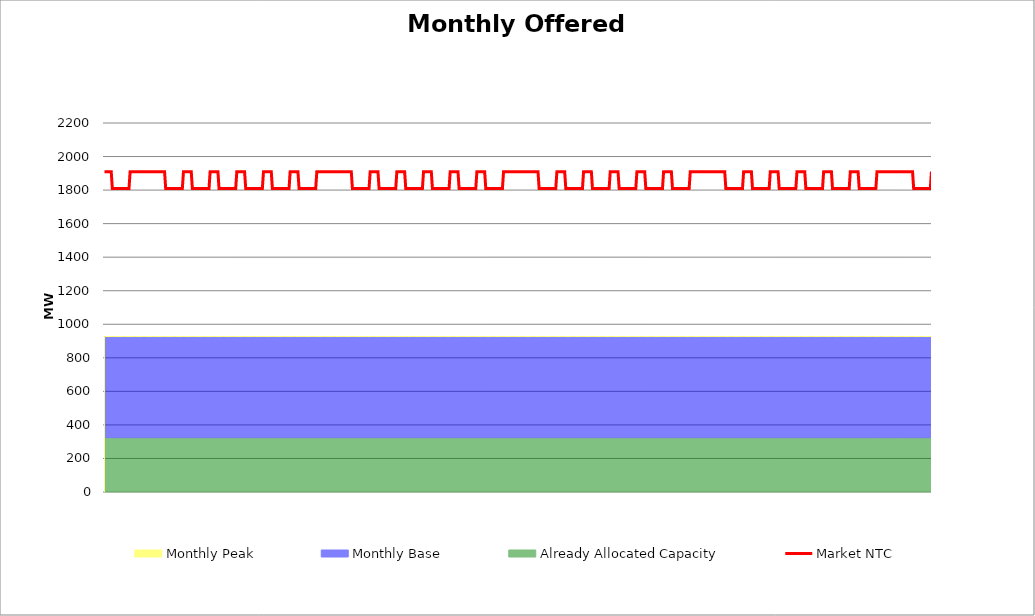
| Category | Market NTC |
|---|---|
| 0 | 1910 |
| 1 | 1910 |
| 2 | 1910 |
| 3 | 1910 |
| 4 | 1910 |
| 5 | 1910 |
| 6 | 1910 |
| 7 | 1810 |
| 8 | 1810 |
| 9 | 1810 |
| 10 | 1810 |
| 11 | 1810 |
| 12 | 1810 |
| 13 | 1810 |
| 14 | 1810 |
| 15 | 1810 |
| 16 | 1810 |
| 17 | 1810 |
| 18 | 1810 |
| 19 | 1810 |
| 20 | 1810 |
| 21 | 1810 |
| 22 | 1810 |
| 23 | 1910 |
| 24 | 1910 |
| 25 | 1910 |
| 26 | 1910 |
| 27 | 1910 |
| 28 | 1910 |
| 29 | 1910 |
| 30 | 1910 |
| 31 | 1910 |
| 32 | 1910 |
| 33 | 1910 |
| 34 | 1910 |
| 35 | 1910 |
| 36 | 1910 |
| 37 | 1910 |
| 38 | 1910 |
| 39 | 1910 |
| 40 | 1910 |
| 41 | 1910 |
| 42 | 1910 |
| 43 | 1910 |
| 44 | 1910 |
| 45 | 1910 |
| 46 | 1910 |
| 47 | 1910 |
| 48 | 1910 |
| 49 | 1910 |
| 50 | 1910 |
| 51 | 1910 |
| 52 | 1910 |
| 53 | 1910 |
| 54 | 1910 |
| 55 | 1810 |
| 56 | 1810 |
| 57 | 1810 |
| 58 | 1810 |
| 59 | 1810 |
| 60 | 1810 |
| 61 | 1810 |
| 62 | 1810 |
| 63 | 1810 |
| 64 | 1810 |
| 65 | 1810 |
| 66 | 1810 |
| 67 | 1810 |
| 68 | 1810 |
| 69 | 1810 |
| 70 | 1810 |
| 71 | 1910 |
| 72 | 1910 |
| 73 | 1910 |
| 74 | 1910 |
| 75 | 1910 |
| 76 | 1910 |
| 77 | 1910 |
| 78 | 1910 |
| 79 | 1810 |
| 80 | 1810 |
| 81 | 1810 |
| 82 | 1810 |
| 83 | 1810 |
| 84 | 1810 |
| 85 | 1810 |
| 86 | 1810 |
| 87 | 1810 |
| 88 | 1810 |
| 89 | 1810 |
| 90 | 1810 |
| 91 | 1810 |
| 92 | 1810 |
| 93 | 1810 |
| 94 | 1810 |
| 95 | 1910 |
| 96 | 1910 |
| 97 | 1910 |
| 98 | 1910 |
| 99 | 1910 |
| 100 | 1910 |
| 101 | 1910 |
| 102 | 1910 |
| 103 | 1810 |
| 104 | 1810 |
| 105 | 1810 |
| 106 | 1810 |
| 107 | 1810 |
| 108 | 1810 |
| 109 | 1810 |
| 110 | 1810 |
| 111 | 1810 |
| 112 | 1810 |
| 113 | 1810 |
| 114 | 1810 |
| 115 | 1810 |
| 116 | 1810 |
| 117 | 1810 |
| 118 | 1810 |
| 119 | 1910 |
| 120 | 1910 |
| 121 | 1910 |
| 122 | 1910 |
| 123 | 1910 |
| 124 | 1910 |
| 125 | 1910 |
| 126 | 1910 |
| 127 | 1810 |
| 128 | 1810 |
| 129 | 1810 |
| 130 | 1810 |
| 131 | 1810 |
| 132 | 1810 |
| 133 | 1810 |
| 134 | 1810 |
| 135 | 1810 |
| 136 | 1810 |
| 137 | 1810 |
| 138 | 1810 |
| 139 | 1810 |
| 140 | 1810 |
| 141 | 1810 |
| 142 | 1810 |
| 143 | 1910 |
| 144 | 1910 |
| 145 | 1910 |
| 146 | 1910 |
| 147 | 1910 |
| 148 | 1910 |
| 149 | 1910 |
| 150 | 1910 |
| 151 | 1810 |
| 152 | 1810 |
| 153 | 1810 |
| 154 | 1810 |
| 155 | 1810 |
| 156 | 1810 |
| 157 | 1810 |
| 158 | 1810 |
| 159 | 1810 |
| 160 | 1810 |
| 161 | 1810 |
| 162 | 1810 |
| 163 | 1810 |
| 164 | 1810 |
| 165 | 1810 |
| 166 | 1810 |
| 167 | 1910 |
| 168 | 1910 |
| 169 | 1910 |
| 170 | 1910 |
| 171 | 1910 |
| 172 | 1910 |
| 173 | 1910 |
| 174 | 1910 |
| 175 | 1810 |
| 176 | 1810 |
| 177 | 1810 |
| 178 | 1810 |
| 179 | 1810 |
| 180 | 1810 |
| 181 | 1810 |
| 182 | 1810 |
| 183 | 1810 |
| 184 | 1810 |
| 185 | 1810 |
| 186 | 1810 |
| 187 | 1810 |
| 188 | 1810 |
| 189 | 1810 |
| 190 | 1810 |
| 191 | 1910 |
| 192 | 1910 |
| 193 | 1910 |
| 194 | 1910 |
| 195 | 1910 |
| 196 | 1910 |
| 197 | 1910 |
| 198 | 1910 |
| 199 | 1910 |
| 200 | 1910 |
| 201 | 1910 |
| 202 | 1910 |
| 203 | 1910 |
| 204 | 1910 |
| 205 | 1910 |
| 206 | 1910 |
| 207 | 1910 |
| 208 | 1910 |
| 209 | 1910 |
| 210 | 1910 |
| 211 | 1910 |
| 212 | 1910 |
| 213 | 1910 |
| 214 | 1910 |
| 215 | 1910 |
| 216 | 1910 |
| 217 | 1910 |
| 218 | 1910 |
| 219 | 1910 |
| 220 | 1910 |
| 221 | 1910 |
| 222 | 1910 |
| 223 | 1810 |
| 224 | 1810 |
| 225 | 1810 |
| 226 | 1810 |
| 227 | 1810 |
| 228 | 1810 |
| 229 | 1810 |
| 230 | 1810 |
| 231 | 1810 |
| 232 | 1810 |
| 233 | 1810 |
| 234 | 1810 |
| 235 | 1810 |
| 236 | 1810 |
| 237 | 1810 |
| 238 | 1810 |
| 239 | 1910 |
| 240 | 1910 |
| 241 | 1910 |
| 242 | 1910 |
| 243 | 1910 |
| 244 | 1910 |
| 245 | 1910 |
| 246 | 1910 |
| 247 | 1810 |
| 248 | 1810 |
| 249 | 1810 |
| 250 | 1810 |
| 251 | 1810 |
| 252 | 1810 |
| 253 | 1810 |
| 254 | 1810 |
| 255 | 1810 |
| 256 | 1810 |
| 257 | 1810 |
| 258 | 1810 |
| 259 | 1810 |
| 260 | 1810 |
| 261 | 1810 |
| 262 | 1810 |
| 263 | 1910 |
| 264 | 1910 |
| 265 | 1910 |
| 266 | 1910 |
| 267 | 1910 |
| 268 | 1910 |
| 269 | 1910 |
| 270 | 1910 |
| 271 | 1810 |
| 272 | 1810 |
| 273 | 1810 |
| 274 | 1810 |
| 275 | 1810 |
| 276 | 1810 |
| 277 | 1810 |
| 278 | 1810 |
| 279 | 1810 |
| 280 | 1810 |
| 281 | 1810 |
| 282 | 1810 |
| 283 | 1810 |
| 284 | 1810 |
| 285 | 1810 |
| 286 | 1810 |
| 287 | 1910 |
| 288 | 1910 |
| 289 | 1910 |
| 290 | 1910 |
| 291 | 1910 |
| 292 | 1910 |
| 293 | 1910 |
| 294 | 1910 |
| 295 | 1810 |
| 296 | 1810 |
| 297 | 1810 |
| 298 | 1810 |
| 299 | 1810 |
| 300 | 1810 |
| 301 | 1810 |
| 302 | 1810 |
| 303 | 1810 |
| 304 | 1810 |
| 305 | 1810 |
| 306 | 1810 |
| 307 | 1810 |
| 308 | 1810 |
| 309 | 1810 |
| 310 | 1810 |
| 311 | 1910 |
| 312 | 1910 |
| 313 | 1910 |
| 314 | 1910 |
| 315 | 1910 |
| 316 | 1910 |
| 317 | 1910 |
| 318 | 1910 |
| 319 | 1810 |
| 320 | 1810 |
| 321 | 1810 |
| 322 | 1810 |
| 323 | 1810 |
| 324 | 1810 |
| 325 | 1810 |
| 326 | 1810 |
| 327 | 1810 |
| 328 | 1810 |
| 329 | 1810 |
| 330 | 1810 |
| 331 | 1810 |
| 332 | 1810 |
| 333 | 1810 |
| 334 | 1810 |
| 335 | 1910 |
| 336 | 1910 |
| 337 | 1910 |
| 338 | 1910 |
| 339 | 1910 |
| 340 | 1910 |
| 341 | 1910 |
| 342 | 1910 |
| 343 | 1810 |
| 344 | 1810 |
| 345 | 1810 |
| 346 | 1810 |
| 347 | 1810 |
| 348 | 1810 |
| 349 | 1810 |
| 350 | 1810 |
| 351 | 1810 |
| 352 | 1810 |
| 353 | 1810 |
| 354 | 1810 |
| 355 | 1810 |
| 356 | 1810 |
| 357 | 1810 |
| 358 | 1810 |
| 359 | 1910 |
| 360 | 1910 |
| 361 | 1910 |
| 362 | 1910 |
| 363 | 1910 |
| 364 | 1910 |
| 365 | 1910 |
| 366 | 1910 |
| 367 | 1910 |
| 368 | 1910 |
| 369 | 1910 |
| 370 | 1910 |
| 371 | 1910 |
| 372 | 1910 |
| 373 | 1910 |
| 374 | 1910 |
| 375 | 1910 |
| 376 | 1910 |
| 377 | 1910 |
| 378 | 1910 |
| 379 | 1910 |
| 380 | 1910 |
| 381 | 1910 |
| 382 | 1910 |
| 383 | 1910 |
| 384 | 1910 |
| 385 | 1910 |
| 386 | 1910 |
| 387 | 1910 |
| 388 | 1910 |
| 389 | 1910 |
| 390 | 1910 |
| 391 | 1810 |
| 392 | 1810 |
| 393 | 1810 |
| 394 | 1810 |
| 395 | 1810 |
| 396 | 1810 |
| 397 | 1810 |
| 398 | 1810 |
| 399 | 1810 |
| 400 | 1810 |
| 401 | 1810 |
| 402 | 1810 |
| 403 | 1810 |
| 404 | 1810 |
| 405 | 1810 |
| 406 | 1810 |
| 407 | 1910 |
| 408 | 1910 |
| 409 | 1910 |
| 410 | 1910 |
| 411 | 1910 |
| 412 | 1910 |
| 413 | 1910 |
| 414 | 1910 |
| 415 | 1810 |
| 416 | 1810 |
| 417 | 1810 |
| 418 | 1810 |
| 419 | 1810 |
| 420 | 1810 |
| 421 | 1810 |
| 422 | 1810 |
| 423 | 1810 |
| 424 | 1810 |
| 425 | 1810 |
| 426 | 1810 |
| 427 | 1810 |
| 428 | 1810 |
| 429 | 1810 |
| 430 | 1810 |
| 431 | 1910 |
| 432 | 1910 |
| 433 | 1910 |
| 434 | 1910 |
| 435 | 1910 |
| 436 | 1910 |
| 437 | 1910 |
| 438 | 1910 |
| 439 | 1810 |
| 440 | 1810 |
| 441 | 1810 |
| 442 | 1810 |
| 443 | 1810 |
| 444 | 1810 |
| 445 | 1810 |
| 446 | 1810 |
| 447 | 1810 |
| 448 | 1810 |
| 449 | 1810 |
| 450 | 1810 |
| 451 | 1810 |
| 452 | 1810 |
| 453 | 1810 |
| 454 | 1810 |
| 455 | 1910 |
| 456 | 1910 |
| 457 | 1910 |
| 458 | 1910 |
| 459 | 1910 |
| 460 | 1910 |
| 461 | 1910 |
| 462 | 1910 |
| 463 | 1810 |
| 464 | 1810 |
| 465 | 1810 |
| 466 | 1810 |
| 467 | 1810 |
| 468 | 1810 |
| 469 | 1810 |
| 470 | 1810 |
| 471 | 1810 |
| 472 | 1810 |
| 473 | 1810 |
| 474 | 1810 |
| 475 | 1810 |
| 476 | 1810 |
| 477 | 1810 |
| 478 | 1810 |
| 479 | 1910 |
| 480 | 1910 |
| 481 | 1910 |
| 482 | 1910 |
| 483 | 1910 |
| 484 | 1910 |
| 485 | 1910 |
| 486 | 1910 |
| 487 | 1810 |
| 488 | 1810 |
| 489 | 1810 |
| 490 | 1810 |
| 491 | 1810 |
| 492 | 1810 |
| 493 | 1810 |
| 494 | 1810 |
| 495 | 1810 |
| 496 | 1810 |
| 497 | 1810 |
| 498 | 1810 |
| 499 | 1810 |
| 500 | 1810 |
| 501 | 1810 |
| 502 | 1810 |
| 503 | 1910 |
| 504 | 1910 |
| 505 | 1910 |
| 506 | 1910 |
| 507 | 1910 |
| 508 | 1910 |
| 509 | 1910 |
| 510 | 1910 |
| 511 | 1810 |
| 512 | 1810 |
| 513 | 1810 |
| 514 | 1810 |
| 515 | 1810 |
| 516 | 1810 |
| 517 | 1810 |
| 518 | 1810 |
| 519 | 1810 |
| 520 | 1810 |
| 521 | 1810 |
| 522 | 1810 |
| 523 | 1810 |
| 524 | 1810 |
| 525 | 1810 |
| 526 | 1810 |
| 527 | 1910 |
| 528 | 1910 |
| 529 | 1910 |
| 530 | 1910 |
| 531 | 1910 |
| 532 | 1910 |
| 533 | 1910 |
| 534 | 1910 |
| 535 | 1910 |
| 536 | 1910 |
| 537 | 1910 |
| 538 | 1910 |
| 539 | 1910 |
| 540 | 1910 |
| 541 | 1910 |
| 542 | 1910 |
| 543 | 1910 |
| 544 | 1910 |
| 545 | 1910 |
| 546 | 1910 |
| 547 | 1910 |
| 548 | 1910 |
| 549 | 1910 |
| 550 | 1910 |
| 551 | 1910 |
| 552 | 1910 |
| 553 | 1910 |
| 554 | 1910 |
| 555 | 1910 |
| 556 | 1910 |
| 557 | 1910 |
| 558 | 1910 |
| 559 | 1810 |
| 560 | 1810 |
| 561 | 1810 |
| 562 | 1810 |
| 563 | 1810 |
| 564 | 1810 |
| 565 | 1810 |
| 566 | 1810 |
| 567 | 1810 |
| 568 | 1810 |
| 569 | 1810 |
| 570 | 1810 |
| 571 | 1810 |
| 572 | 1810 |
| 573 | 1810 |
| 574 | 1810 |
| 575 | 1910 |
| 576 | 1910 |
| 577 | 1910 |
| 578 | 1910 |
| 579 | 1910 |
| 580 | 1910 |
| 581 | 1910 |
| 582 | 1910 |
| 583 | 1810 |
| 584 | 1810 |
| 585 | 1810 |
| 586 | 1810 |
| 587 | 1810 |
| 588 | 1810 |
| 589 | 1810 |
| 590 | 1810 |
| 591 | 1810 |
| 592 | 1810 |
| 593 | 1810 |
| 594 | 1810 |
| 595 | 1810 |
| 596 | 1810 |
| 597 | 1810 |
| 598 | 1810 |
| 599 | 1910 |
| 600 | 1910 |
| 601 | 1910 |
| 602 | 1910 |
| 603 | 1910 |
| 604 | 1910 |
| 605 | 1910 |
| 606 | 1910 |
| 607 | 1810 |
| 608 | 1810 |
| 609 | 1810 |
| 610 | 1810 |
| 611 | 1810 |
| 612 | 1810 |
| 613 | 1810 |
| 614 | 1810 |
| 615 | 1810 |
| 616 | 1810 |
| 617 | 1810 |
| 618 | 1810 |
| 619 | 1810 |
| 620 | 1810 |
| 621 | 1810 |
| 622 | 1810 |
| 623 | 1910 |
| 624 | 1910 |
| 625 | 1910 |
| 626 | 1910 |
| 627 | 1910 |
| 628 | 1910 |
| 629 | 1910 |
| 630 | 1910 |
| 631 | 1810 |
| 632 | 1810 |
| 633 | 1810 |
| 634 | 1810 |
| 635 | 1810 |
| 636 | 1810 |
| 637 | 1810 |
| 638 | 1810 |
| 639 | 1810 |
| 640 | 1810 |
| 641 | 1810 |
| 642 | 1810 |
| 643 | 1810 |
| 644 | 1810 |
| 645 | 1810 |
| 646 | 1810 |
| 647 | 1910 |
| 648 | 1910 |
| 649 | 1910 |
| 650 | 1910 |
| 651 | 1910 |
| 652 | 1910 |
| 653 | 1910 |
| 654 | 1910 |
| 655 | 1810 |
| 656 | 1810 |
| 657 | 1810 |
| 658 | 1810 |
| 659 | 1810 |
| 660 | 1810 |
| 661 | 1810 |
| 662 | 1810 |
| 663 | 1810 |
| 664 | 1810 |
| 665 | 1810 |
| 666 | 1810 |
| 667 | 1810 |
| 668 | 1810 |
| 669 | 1810 |
| 670 | 1810 |
| 671 | 1910 |
| 672 | 1910 |
| 673 | 1910 |
| 674 | 1910 |
| 675 | 1910 |
| 676 | 1910 |
| 677 | 1910 |
| 678 | 1910 |
| 679 | 1810 |
| 680 | 1810 |
| 681 | 1810 |
| 682 | 1810 |
| 683 | 1810 |
| 684 | 1810 |
| 685 | 1810 |
| 686 | 1810 |
| 687 | 1810 |
| 688 | 1810 |
| 689 | 1810 |
| 690 | 1810 |
| 691 | 1810 |
| 692 | 1810 |
| 693 | 1810 |
| 694 | 1810 |
| 695 | 1910 |
| 696 | 1910 |
| 697 | 1910 |
| 698 | 1910 |
| 699 | 1910 |
| 700 | 1910 |
| 701 | 1910 |
| 702 | 1910 |
| 703 | 1910 |
| 704 | 1910 |
| 705 | 1910 |
| 706 | 1910 |
| 707 | 1910 |
| 708 | 1910 |
| 709 | 1910 |
| 710 | 1910 |
| 711 | 1910 |
| 712 | 1910 |
| 713 | 1910 |
| 714 | 1910 |
| 715 | 1910 |
| 716 | 1910 |
| 717 | 1910 |
| 718 | 1910 |
| 719 | 1910 |
| 720 | 1910 |
| 721 | 1910 |
| 722 | 1910 |
| 723 | 1910 |
| 724 | 1910 |
| 725 | 1910 |
| 726 | 1910 |
| 727 | 1910 |
| 728 | 1810 |
| 729 | 1810 |
| 730 | 1810 |
| 731 | 1810 |
| 732 | 1810 |
| 733 | 1810 |
| 734 | 1810 |
| 735 | 1810 |
| 736 | 1810 |
| 737 | 1810 |
| 738 | 1810 |
| 739 | 1810 |
| 740 | 1810 |
| 741 | 1810 |
| 742 | 1810 |
| 743 | 1810 |
| 744 | 1910 |